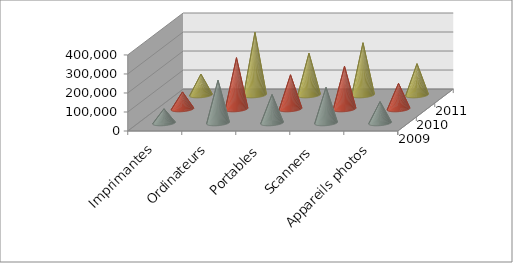
| Category | 2009 | 2010 | 2011 |
|---|---|---|---|
| Imprimantes | 75000 | 90000 | 110000 |
| Ordinateurs | 225000 | 270000 | 330000 |
| Portables | 150000 | 180000 | 220000 |
| Scanners | 187500 | 225000 | 275000 |
| Appareils photos | 112500 | 135000 | 165000 |